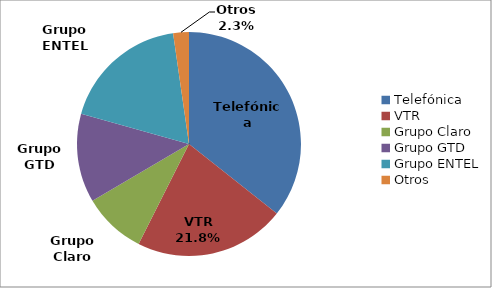
| Category | Series 0 |
|---|---|
| Telefónica | 903865 |
| VTR | 551694 |
| Grupo Claro | 230867 |
| Grupo GTD | 324502 |
| Grupo ENTEL | 466140 |
| Otros | 57565 |